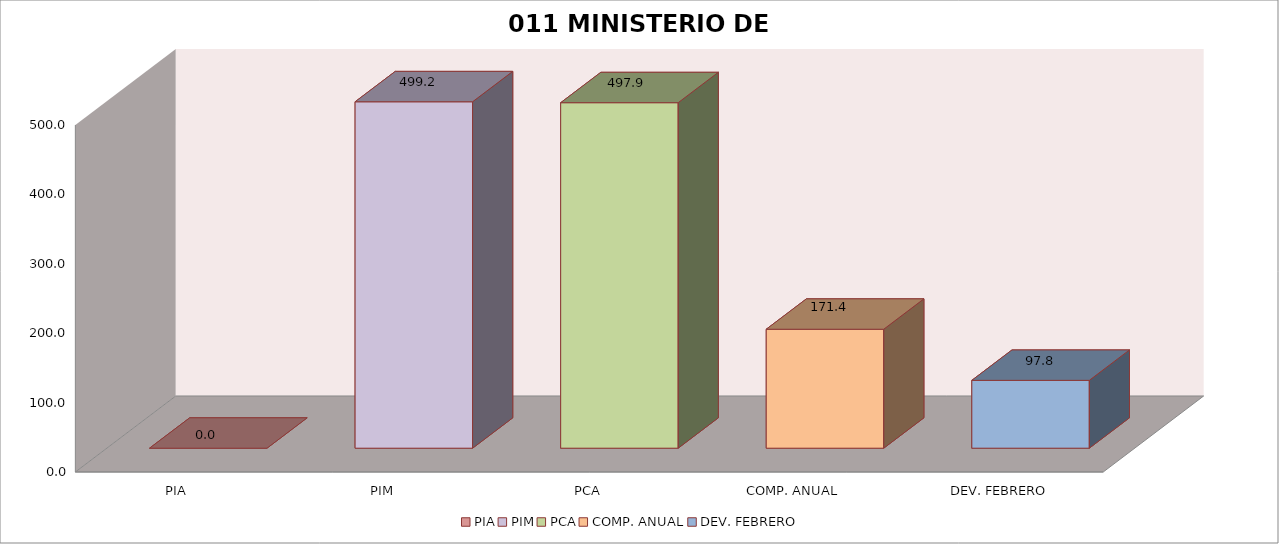
| Category | 011 MINISTERIO DE SALUD |
|---|---|
| PIA | 0 |
| PIM | 499.193 |
| PCA | 497.86 |
| COMP. ANUAL | 171.42 |
| DEV. FEBRERO | 97.779 |